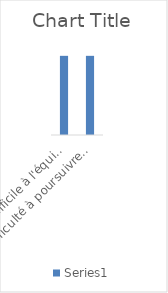
| Category | Series 0 |
|---|---|
| Accès difficile à l'équipement de protection individuelle (masques, gants, désinfectants, savons) | 1 |
| Difficulté à poursuivre son travail ou perte de travail | 1 |